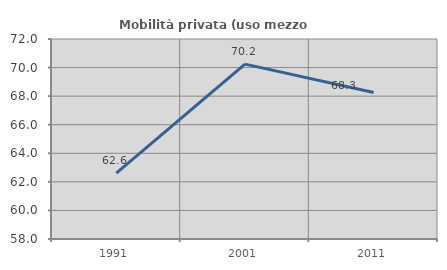
| Category | Mobilità privata (uso mezzo privato) |
|---|---|
| 1991.0 | 62.605 |
| 2001.0 | 70.24 |
| 2011.0 | 68.257 |